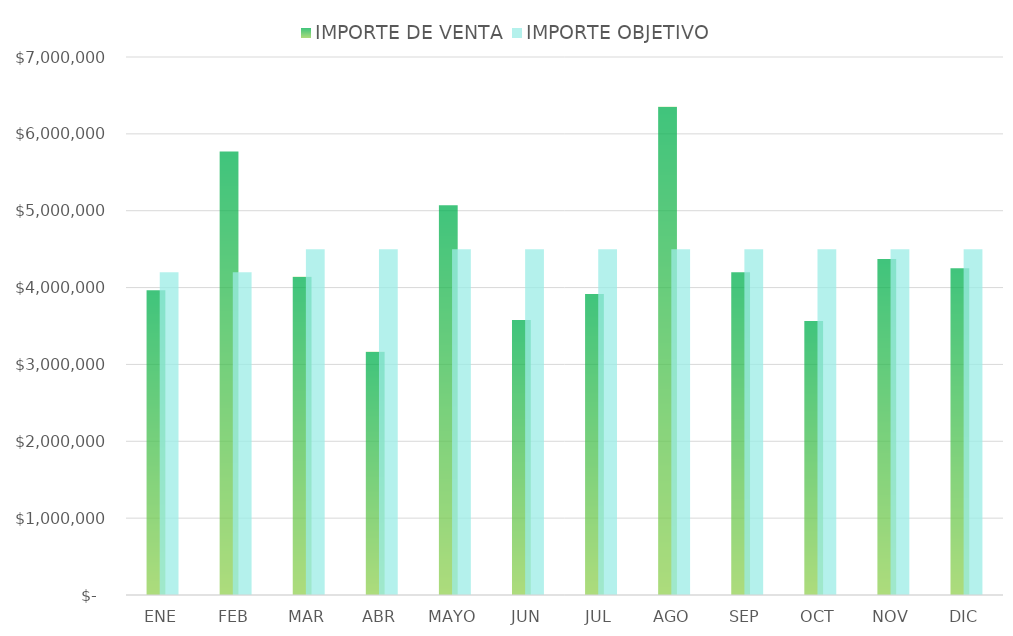
| Category | IMPORTE DE VENTA | IMPORTE OBJETIVO |
|---|---|---|
| ENE | 3964785 | 4200000 |
| FEB | 5772041 | 4200000 |
| MAR | 4139699 | 4500000 |
| ABR | 3166287 | 4500000 |
| MAYO | 5072530 | 4500000 |
| JUN | 3577330 | 4500000 |
| JUL | 3916803 | 4500000 |
| AGO | 6352355 | 4500000 |
| SEP | 4198802 | 4500000 |
| OCT | 3563537 | 4500000 |
| NOV | 4373343 | 4500000 |
| DIC | 4250199 | 4500000 |